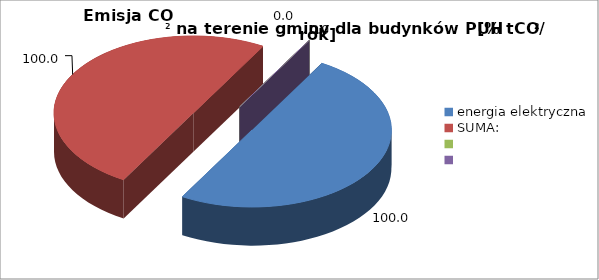
| Category | 100,0 100,0 |
|---|---|
| energia elektryczna | 100 |
| SUMA: | 100 |